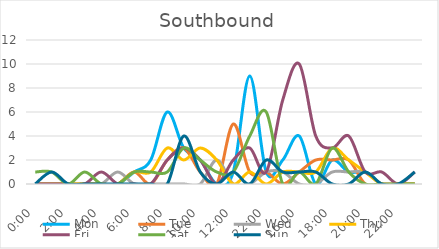
| Category | Mon | Tue | Wed | Thu | Fri | Sat | Sun |
|---|---|---|---|---|---|---|---|
| 0.0 | 0 | 0 | 0 | 0 | 0 | 1 | 0 |
| 0.041667 | 0 | 0 | 0 | 0 | 0 | 1 | 1 |
| 0.083333 | 0 | 0 | 0 | 0 | 0 | 0 | 0 |
| 0.125 | 0 | 0 | 0 | 0 | 0 | 1 | 0 |
| 0.166667 | 0 | 0 | 0 | 0 | 1 | 0 | 0 |
| 0.208333 | 0 | 0 | 1 | 0 | 0 | 0 | 0 |
| 0.25 | 1 | 1 | 0 | 1 | 0 | 1 | 0 |
| 0.291667 | 2 | 0 | 0 | 1 | 0 | 1 | 0 |
| 0.333333 | 6 | 2 | 0 | 3 | 2 | 1 | 0 |
| 0.375 | 3 | 3 | 0 | 2 | 3 | 3 | 4 |
| 0.416667 | 2 | 1 | 0 | 3 | 2 | 2 | 1 |
| 0.458333 | 0 | 0 | 2 | 2 | 0 | 1 | 0 |
| 0.5 | 1 | 5 | 0 | 0 | 2 | 1 | 1 |
| 0.541667 | 9 | 1 | 0 | 1 | 3 | 4 | 0 |
| 1900-01-02 22:00:00 | 1 | 1 | 1 | 0 | 1 | 6 | 2 |
| 0.625 | 2 | 0 | 1 | 1 | 7 | 0 | 1 |
| 0.666667 | 4 | 1 | 0 | 1 | 10 | 1 | 1 |
| 0.708333 | 0 | 2 | 0 | 1 | 4 | 0 | 1 |
| 0.75 | 2 | 2 | 1 | 3 | 3 | 3 | 0 |
| 0.791667 | 1 | 2 | 1 | 2 | 4 | 1 | 0 |
| 0.833333 | 1 | 0 | 1 | 1 | 1 | 0 | 1 |
| 0.875 | 0 | 0 | 0 | 0 | 1 | 0 | 0 |
| 0.916667 | 0 | 0 | 0 | 0 | 0 | 0 | 0 |
| 0.958333 | 0 | 0 | 0 | 0 | 1 | 0 | 1 |